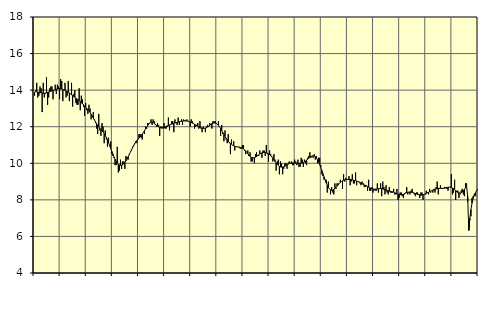
| Category | Tillverkning av verkstadsvaror, SNI 25-30, 33 | Series 1 |
|---|---|---|
| nan | 13.7 | 13.88 |
| 87.0 | 14 | 13.92 |
| 87.0 | 14.4 | 13.91 |
| 87.0 | 13.6 | 13.89 |
| 87.0 | 13.7 | 13.88 |
| 87.0 | 14.2 | 13.87 |
| 87.0 | 14.1 | 13.85 |
| 87.0 | 12.8 | 13.84 |
| 87.0 | 14.4 | 13.83 |
| 87.0 | 13.6 | 13.83 |
| 87.0 | 13.8 | 13.84 |
| 87.0 | 14.7 | 13.86 |
| nan | 13.2 | 13.88 |
| 88.0 | 13.6 | 13.9 |
| 88.0 | 14.1 | 13.92 |
| 88.0 | 14.2 | 13.94 |
| 88.0 | 14.2 | 13.96 |
| 88.0 | 13.5 | 13.98 |
| 88.0 | 14 | 14 |
| 88.0 | 14.3 | 14.02 |
| 88.0 | 13.8 | 14.05 |
| 88.0 | 14.3 | 14.06 |
| 88.0 | 14.2 | 14.07 |
| 88.0 | 13.5 | 14.08 |
| nan | 14.6 | 14.07 |
| 89.0 | 14.5 | 14.06 |
| 89.0 | 13.4 | 14.04 |
| 89.0 | 14 | 14.01 |
| 89.0 | 14.4 | 13.98 |
| 89.0 | 13.6 | 13.95 |
| 89.0 | 13.7 | 13.92 |
| 89.0 | 14.5 | 13.89 |
| 89.0 | 13.4 | 13.85 |
| 89.0 | 13.8 | 13.8 |
| 89.0 | 14.4 | 13.75 |
| 89.0 | 13.1 | 13.71 |
| nan | 13.8 | 13.66 |
| 90.0 | 14 | 13.61 |
| 90.0 | 13.3 | 13.56 |
| 90.0 | 13.2 | 13.52 |
| 90.0 | 13.2 | 13.47 |
| 90.0 | 14.1 | 13.42 |
| 90.0 | 12.9 | 13.37 |
| 90.0 | 13.7 | 13.32 |
| 90.0 | 13.5 | 13.26 |
| 90.0 | 13.1 | 13.2 |
| 90.0 | 12.6 | 13.13 |
| 90.0 | 13.3 | 13.07 |
| nan | 12.9 | 13 |
| 91.0 | 12.7 | 12.93 |
| 91.0 | 13.2 | 12.86 |
| 91.0 | 13 | 12.78 |
| 91.0 | 12.4 | 12.69 |
| 91.0 | 12.6 | 12.59 |
| 91.0 | 12.8 | 12.48 |
| 91.0 | 12.4 | 12.37 |
| 91.0 | 12.2 | 12.27 |
| 91.0 | 11.9 | 12.17 |
| 91.0 | 11.6 | 12.08 |
| 91.0 | 12.7 | 11.99 |
| nan | 11.8 | 11.92 |
| 92.0 | 11.5 | 11.85 |
| 92.0 | 12.2 | 11.78 |
| 92.0 | 12 | 11.71 |
| 92.0 | 11.1 | 11.62 |
| 92.0 | 11.8 | 11.52 |
| 92.0 | 11.3 | 11.41 |
| 92.0 | 10.9 | 11.27 |
| 92.0 | 11.4 | 11.12 |
| 92.0 | 11 | 10.97 |
| 92.0 | 11.2 | 10.81 |
| 92.0 | 10.5 | 10.65 |
| nan | 10.4 | 10.5 |
| 93.0 | 10.3 | 10.35 |
| 93.0 | 9.9 | 10.22 |
| 93.0 | 9.9 | 10.11 |
| 93.0 | 10.9 | 10.01 |
| 93.0 | 9.5 | 9.95 |
| 93.0 | 9.6 | 9.91 |
| 93.0 | 10.2 | 9.89 |
| 93.0 | 9.7 | 9.9 |
| 93.0 | 10.1 | 9.93 |
| 93.0 | 10.1 | 9.98 |
| 93.0 | 9.7 | 10.05 |
| nan | 10.4 | 10.13 |
| 94.0 | 10.3 | 10.24 |
| 94.0 | 10.2 | 10.35 |
| 94.0 | 10.5 | 10.47 |
| 94.0 | 10.6 | 10.6 |
| 94.0 | 10.7 | 10.72 |
| 94.0 | 10.9 | 10.84 |
| 94.0 | 11 | 10.96 |
| 94.0 | 11.1 | 11.07 |
| 94.0 | 11.2 | 11.16 |
| 94.0 | 11.1 | 11.24 |
| 94.0 | 11.3 | 11.32 |
| nan | 11.6 | 11.38 |
| 95.0 | 11.6 | 11.45 |
| 95.0 | 11.4 | 11.52 |
| 95.0 | 11.3 | 11.6 |
| 95.0 | 11.7 | 11.69 |
| 95.0 | 11.6 | 11.78 |
| 95.0 | 12 | 11.88 |
| 95.0 | 11.9 | 11.98 |
| 95.0 | 12.2 | 12.07 |
| 95.0 | 12.2 | 12.15 |
| 95.0 | 12.2 | 12.21 |
| 95.0 | 12.4 | 12.25 |
| nan | 12.1 | 12.25 |
| 96.0 | 12.4 | 12.23 |
| 96.0 | 12.3 | 12.19 |
| 96.0 | 12.1 | 12.14 |
| 96.0 | 12 | 12.09 |
| 96.0 | 12.2 | 12.03 |
| 96.0 | 12.1 | 11.99 |
| 96.0 | 11.5 | 11.95 |
| 96.0 | 12 | 11.93 |
| 96.0 | 12 | 11.93 |
| 96.0 | 11.9 | 11.94 |
| 96.0 | 12.2 | 11.96 |
| nan | 11.9 | 11.99 |
| 97.0 | 11.9 | 12.02 |
| 97.0 | 12 | 12.05 |
| 97.0 | 12.5 | 12.08 |
| 97.0 | 11.8 | 12.1 |
| 97.0 | 12.1 | 12.12 |
| 97.0 | 12.3 | 12.14 |
| 97.0 | 12.3 | 12.16 |
| 97.0 | 11.7 | 12.19 |
| 97.0 | 12.4 | 12.21 |
| 97.0 | 12.2 | 12.22 |
| 97.0 | 12.1 | 12.24 |
| nan | 12.5 | 12.26 |
| 98.0 | 12.1 | 12.27 |
| 98.0 | 12.3 | 12.29 |
| 98.0 | 12.4 | 12.3 |
| 98.0 | 12.1 | 12.31 |
| 98.0 | 12.4 | 12.32 |
| 98.0 | 12.3 | 12.33 |
| 98.0 | 12.3 | 12.33 |
| 98.0 | 12.4 | 12.32 |
| 98.0 | 12.3 | 12.31 |
| 98.0 | 12.3 | 12.29 |
| 98.0 | 12 | 12.26 |
| nan | 12.4 | 12.23 |
| 99.0 | 12.3 | 12.2 |
| 99.0 | 12.2 | 12.17 |
| 99.0 | 11.9 | 12.13 |
| 99.0 | 12 | 12.1 |
| 99.0 | 12.1 | 12.07 |
| 99.0 | 12.2 | 12.03 |
| 99.0 | 11.9 | 12 |
| 99.0 | 12.3 | 11.96 |
| 99.0 | 11.9 | 11.94 |
| 99.0 | 11.7 | 11.92 |
| 99.0 | 12 | 11.91 |
| nan | 11.9 | 11.91 |
| 0.0 | 11.7 | 11.93 |
| 0.0 | 12 | 11.95 |
| 0.0 | 12.1 | 11.99 |
| 0.0 | 12 | 12.03 |
| 0.0 | 12.2 | 12.08 |
| 0.0 | 12.1 | 12.13 |
| 0.0 | 11.9 | 12.17 |
| 0.0 | 12.3 | 12.19 |
| 0.0 | 12.3 | 12.21 |
| 0.0 | 12.3 | 12.2 |
| 0.0 | 12.2 | 12.18 |
| nan | 12.1 | 12.13 |
| 1.0 | 12.3 | 12.07 |
| 1.0 | 12 | 11.99 |
| 1.0 | 11.5 | 11.9 |
| 1.0 | 12.1 | 11.79 |
| 1.0 | 11.6 | 11.68 |
| 1.0 | 11.2 | 11.57 |
| 1.0 | 11.8 | 11.47 |
| 1.0 | 11.3 | 11.37 |
| 1.0 | 11.1 | 11.29 |
| 1.0 | 11.6 | 11.21 |
| 1.0 | 11.1 | 11.15 |
| nan | 10.5 | 11.09 |
| 2.0 | 11.3 | 11.04 |
| 2.0 | 11 | 10.99 |
| 2.0 | 11.2 | 10.96 |
| 2.0 | 10.7 | 10.93 |
| 2.0 | 10.9 | 10.91 |
| 2.0 | 10.9 | 10.9 |
| 2.0 | 10.9 | 10.89 |
| 2.0 | 10.9 | 10.88 |
| 2.0 | 10.8 | 10.87 |
| 2.0 | 10.8 | 10.85 |
| 2.0 | 11 | 10.82 |
| nan | 11 | 10.79 |
| 3.0 | 10.7 | 10.74 |
| 3.0 | 10.5 | 10.68 |
| 3.0 | 10.6 | 10.6 |
| 3.0 | 10.7 | 10.52 |
| 3.0 | 10.4 | 10.45 |
| 3.0 | 10.6 | 10.38 |
| 3.0 | 10.1 | 10.33 |
| 3.0 | 10.1 | 10.31 |
| 3.0 | 10.3 | 10.3 |
| 3.0 | 10 | 10.31 |
| 3.0 | 10.5 | 10.34 |
| nan | 10.6 | 10.37 |
| 4.0 | 10.4 | 10.42 |
| 4.0 | 10.4 | 10.46 |
| 4.0 | 10.7 | 10.51 |
| 4.0 | 10.5 | 10.55 |
| 4.0 | 10.3 | 10.57 |
| 4.0 | 10.7 | 10.58 |
| 4.0 | 10.7 | 10.59 |
| 4.0 | 10.4 | 10.59 |
| 4.0 | 11 | 10.57 |
| 4.0 | 10.5 | 10.55 |
| 4.0 | 10.1 | 10.52 |
| nan | 10.7 | 10.47 |
| 5.0 | 10.5 | 10.42 |
| 5.0 | 10.4 | 10.35 |
| 5.0 | 10.1 | 10.27 |
| 5.0 | 10.5 | 10.19 |
| 5.0 | 10.2 | 10.11 |
| 5.0 | 9.6 | 10.03 |
| 5.0 | 10.1 | 9.95 |
| 5.0 | 10.2 | 9.89 |
| 5.0 | 9.4 | 9.83 |
| 5.0 | 10.1 | 9.8 |
| 5.0 | 10 | 9.79 |
| nan | 9.4 | 9.79 |
| 6.0 | 9.7 | 9.81 |
| 6.0 | 10 | 9.84 |
| 6.0 | 10 | 9.88 |
| 6.0 | 9.7 | 9.91 |
| 6.0 | 10 | 9.95 |
| 6.0 | 10.1 | 9.98 |
| 6.0 | 10 | 10 |
| 6.0 | 10.1 | 10.01 |
| 6.0 | 9.9 | 10.02 |
| 6.0 | 9.9 | 10.02 |
| 6.0 | 10.2 | 10.01 |
| nan | 10.1 | 10.01 |
| 7.0 | 9.9 | 10 |
| 7.0 | 10.2 | 10 |
| 7.0 | 9.8 | 10 |
| 7.0 | 9.8 | 9.99 |
| 7.0 | 10.3 | 10 |
| 7.0 | 10.2 | 10.01 |
| 7.0 | 9.8 | 10.03 |
| 7.0 | 10.2 | 10.07 |
| 7.0 | 10 | 10.12 |
| 7.0 | 9.9 | 10.17 |
| 7.0 | 10.3 | 10.23 |
| nan | 10.4 | 10.28 |
| 8.0 | 10.6 | 10.33 |
| 8.0 | 10.3 | 10.37 |
| 8.0 | 10.4 | 10.4 |
| 8.0 | 10.3 | 10.41 |
| 8.0 | 10.5 | 10.4 |
| 8.0 | 10.2 | 10.36 |
| 8.0 | 10.4 | 10.29 |
| 8.0 | 10 | 10.19 |
| 8.0 | 10.3 | 10.07 |
| 8.0 | 10.3 | 9.93 |
| 8.0 | 9.9 | 9.78 |
| nan | 9.4 | 9.61 |
| 9.0 | 9.3 | 9.43 |
| 9.0 | 9.1 | 9.26 |
| 9.0 | 9.1 | 9.09 |
| 9.0 | 9.1 | 8.93 |
| 9.0 | 8.4 | 8.79 |
| 9.0 | 9 | 8.68 |
| 9.0 | 8.6 | 8.6 |
| 9.0 | 8.3 | 8.55 |
| 9.0 | 8.7 | 8.53 |
| 9.0 | 8.4 | 8.54 |
| 9.0 | 8.3 | 8.57 |
| nan | 8.9 | 8.62 |
| 10.0 | 8.6 | 8.68 |
| 10.0 | 8.9 | 8.75 |
| 10.0 | 8.9 | 8.82 |
| 10.0 | 8.9 | 8.89 |
| 10.0 | 9.1 | 8.95 |
| 10.0 | 9 | 9 |
| 10.0 | 8.6 | 9.04 |
| 10.0 | 9.4 | 9.07 |
| 10.0 | 9 | 9.09 |
| 10.0 | 9.2 | 9.1 |
| 10.0 | 9.1 | 9.11 |
| nan | 9.1 | 9.12 |
| 11.0 | 9.3 | 9.12 |
| 11.0 | 8.8 | 9.12 |
| 11.0 | 9 | 9.11 |
| 11.0 | 9.4 | 9.1 |
| 11.0 | 8.9 | 9.08 |
| 11.0 | 8.9 | 9.06 |
| 11.0 | 9.5 | 9.05 |
| 11.0 | 8.8 | 9.03 |
| 11.0 | 9 | 9.01 |
| 11.0 | 9 | 8.98 |
| 11.0 | 8.9 | 8.95 |
| nan | 8.8 | 8.92 |
| 12.0 | 9 | 8.89 |
| 12.0 | 8.9 | 8.85 |
| 12.0 | 8.7 | 8.82 |
| 12.0 | 8.7 | 8.79 |
| 12.0 | 8.8 | 8.76 |
| 12.0 | 8.5 | 8.72 |
| 12.0 | 9.1 | 8.69 |
| 12.0 | 8.5 | 8.65 |
| 12.0 | 8.5 | 8.63 |
| 12.0 | 8.7 | 8.61 |
| 12.0 | 8.4 | 8.59 |
| nan | 8.6 | 8.58 |
| 13.0 | 8.5 | 8.58 |
| 13.0 | 8.5 | 8.59 |
| 13.0 | 8.9 | 8.6 |
| 13.0 | 8.4 | 8.61 |
| 13.0 | 8.6 | 8.62 |
| 13.0 | 8.9 | 8.62 |
| 13.0 | 8.2 | 8.61 |
| 13.0 | 9 | 8.6 |
| 13.0 | 8.7 | 8.58 |
| 13.0 | 8.3 | 8.56 |
| 13.0 | 8.8 | 8.53 |
| nan | 8.4 | 8.51 |
| 14.0 | 8.3 | 8.5 |
| 14.0 | 8.7 | 8.48 |
| 14.0 | 8.4 | 8.47 |
| 14.0 | 8.4 | 8.45 |
| 14.0 | 8.4 | 8.44 |
| 14.0 | 8.6 | 8.42 |
| 14.0 | 8.3 | 8.39 |
| 14.0 | 8.3 | 8.36 |
| 14.0 | 8.6 | 8.33 |
| 14.0 | 8 | 8.31 |
| 14.0 | 8.1 | 8.29 |
| nan | 8.4 | 8.28 |
| 15.0 | 8.4 | 8.28 |
| 15.0 | 8.2 | 8.29 |
| 15.0 | 8.1 | 8.31 |
| 15.0 | 8.3 | 8.34 |
| 15.0 | 8.4 | 8.37 |
| 15.0 | 8.7 | 8.39 |
| 15.0 | 8.3 | 8.41 |
| 15.0 | 8.4 | 8.43 |
| 15.0 | 8.3 | 8.43 |
| 15.0 | 8.5 | 8.42 |
| 15.0 | 8.6 | 8.41 |
| nan | 8.4 | 8.39 |
| 16.0 | 8.3 | 8.37 |
| 16.0 | 8.2 | 8.35 |
| 16.0 | 8.4 | 8.32 |
| 16.0 | 8.4 | 8.3 |
| 16.0 | 8.3 | 8.28 |
| 16.0 | 8.1 | 8.27 |
| 16.0 | 8.4 | 8.26 |
| 16.0 | 8.4 | 8.26 |
| 16.0 | 8 | 8.28 |
| 16.0 | 8.3 | 8.3 |
| 16.0 | 8.3 | 8.32 |
| nan | 8.5 | 8.34 |
| 17.0 | 8.4 | 8.38 |
| 17.0 | 8.3 | 8.41 |
| 17.0 | 8.6 | 8.44 |
| 17.0 | 8.4 | 8.47 |
| 17.0 | 8.5 | 8.51 |
| 17.0 | 8.4 | 8.53 |
| 17.0 | 8.6 | 8.56 |
| 17.0 | 8.4 | 8.58 |
| 17.0 | 8.7 | 8.6 |
| 17.0 | 9 | 8.61 |
| 17.0 | 8.3 | 8.63 |
| nan | 8.6 | 8.63 |
| 18.0 | 8.8 | 8.63 |
| 18.0 | 8.6 | 8.63 |
| 18.0 | 8.6 | 8.63 |
| 18.0 | 8.6 | 8.63 |
| 18.0 | 8.7 | 8.64 |
| 18.0 | 8.7 | 8.66 |
| 18.0 | 8.6 | 8.67 |
| 18.0 | 8.5 | 8.69 |
| 18.0 | 8.7 | 8.7 |
| 18.0 | 8.7 | 8.69 |
| 18.0 | 9.4 | 8.68 |
| nan | 8.3 | 8.65 |
| 19.0 | 8.4 | 8.61 |
| 19.0 | 9.1 | 8.56 |
| 19.0 | 8 | 8.5 |
| 19.0 | 8.5 | 8.45 |
| 19.0 | 8.5 | 8.4 |
| 19.0 | 8.1 | 8.38 |
| 19.0 | 8.3 | 8.37 |
| 19.0 | 8.5 | 8.39 |
| 19.0 | 8.6 | 8.43 |
| 19.0 | 8.3 | 8.49 |
| 19.0 | 8.2 | 8.57 |
| nan | 8.9 | 8.65 |
| 20.0 | 8.9 | 8.75 |
| 20.0 | 7.9 | 8.19 |
| 20.0 | 6.8 | 6.33 |
| 20.0 | 6.9 | 6.99 |
| 20.0 | 7.1 | 7.47 |
| 20.0 | 8.1 | 7.82 |
| 20.0 | 8.2 | 8.07 |
| 20.0 | 8.3 | 8.25 |
| 20.0 | 8.2 | 8.37 |
| 20.0 | 8.5 | 8.47 |
| 20.0 | 8.6 | 8.53 |